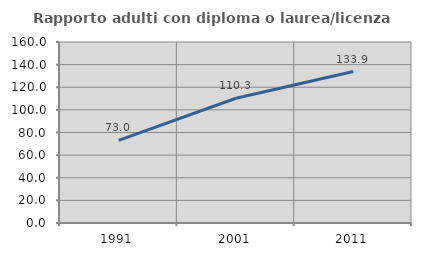
| Category | Rapporto adulti con diploma o laurea/licenza media  |
|---|---|
| 1991.0 | 73.005 |
| 2001.0 | 110.273 |
| 2011.0 | 133.892 |